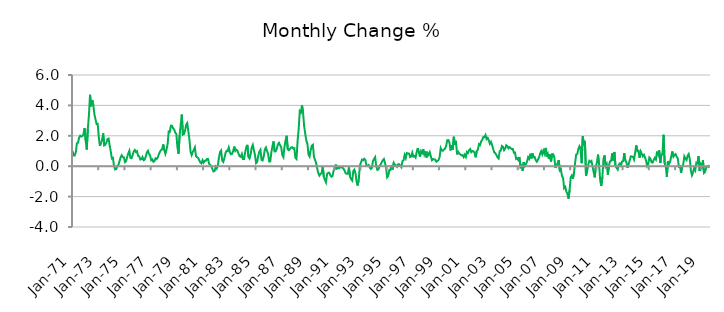
| Category | Series 0 |
|---|---|
| 1971-01-01 | 1.014 |
| 1971-02-01 | 0.711 |
| 1971-03-01 | 0.712 |
| 1971-04-01 | 0.919 |
| 1971-05-01 | 1.51 |
| 1971-06-01 | 1.551 |
| 1971-07-01 | 1.878 |
| 1971-08-01 | 2.005 |
| 1971-09-01 | 1.95 |
| 1971-10-01 | 1.987 |
| 1971-11-01 | 2.104 |
| 1971-12-01 | 2.509 |
| 1972-01-01 | 1.699 |
| 1972-02-01 | 1.094 |
| 1972-03-01 | 2.462 |
| 1972-04-01 | 3.36 |
| 1972-05-01 | 4.697 |
| 1972-06-01 | 3.937 |
| 1972-07-01 | 4.355 |
| 1972-08-01 | 4.026 |
| 1972-09-01 | 3.417 |
| 1972-10-01 | 3.088 |
| 1972-11-01 | 2.774 |
| 1972-12-01 | 2.784 |
| 1973-01-01 | 1.938 |
| 1973-02-01 | 1.343 |
| 1973-03-01 | 1.524 |
| 1973-04-01 | 1.712 |
| 1973-05-01 | 2.158 |
| 1973-06-01 | 1.373 |
| 1973-07-01 | 1.418 |
| 1973-08-01 | 1.551 |
| 1973-09-01 | 1.782 |
| 1973-10-01 | 1.816 |
| 1973-11-01 | 1.359 |
| 1973-12-01 | 0.961 |
| 1974-01-01 | 0.511 |
| 1974-02-01 | 0.548 |
| 1974-03-01 | -0.022 |
| 1974-04-01 | -0.216 |
| 1974-05-01 | -0.191 |
| 1974-06-01 | 0.007 |
| 1974-07-01 | 0.097 |
| 1974-08-01 | 0.326 |
| 1974-09-01 | 0.591 |
| 1974-10-01 | 0.722 |
| 1974-11-01 | 0.594 |
| 1974-12-01 | 0.583 |
| 1975-01-01 | 0.268 |
| 1975-02-01 | 0.337 |
| 1975-03-01 | 0.597 |
| 1975-04-01 | 0.845 |
| 1975-05-01 | 1.017 |
| 1975-06-01 | 0.539 |
| 1975-07-01 | 0.526 |
| 1975-08-01 | 0.722 |
| 1975-09-01 | 0.97 |
| 1975-10-01 | 1.067 |
| 1975-11-01 | 0.93 |
| 1975-12-01 | 0.985 |
| 1976-01-01 | 0.687 |
| 1976-02-01 | 0.643 |
| 1976-03-01 | 0.437 |
| 1976-04-01 | 0.463 |
| 1976-05-01 | 0.603 |
| 1976-06-01 | 0.392 |
| 1976-07-01 | 0.432 |
| 1976-08-01 | 0.636 |
| 1976-09-01 | 0.905 |
| 1976-10-01 | 1.011 |
| 1976-11-01 | 0.8 |
| 1976-12-01 | 0.709 |
| 1977-01-01 | 0.392 |
| 1977-02-01 | 0.448 |
| 1977-03-01 | 0.289 |
| 1977-04-01 | 0.338 |
| 1977-05-01 | 0.521 |
| 1977-06-01 | 0.47 |
| 1977-07-01 | 0.575 |
| 1977-08-01 | 0.784 |
| 1977-09-01 | 0.951 |
| 1977-10-01 | 1.061 |
| 1977-11-01 | 1.111 |
| 1977-12-01 | 1.434 |
| 1978-01-01 | 1.05 |
| 1978-02-01 | 0.811 |
| 1978-03-01 | 1.084 |
| 1978-04-01 | 1.443 |
| 1978-05-01 | 2.28 |
| 1978-06-01 | 2.255 |
| 1978-07-01 | 2.668 |
| 1978-08-01 | 2.665 |
| 1978-09-01 | 2.498 |
| 1978-10-01 | 2.424 |
| 1978-11-01 | 2.207 |
| 1978-12-01 | 2.133 |
| 1979-01-01 | 1.242 |
| 1979-02-01 | 0.823 |
| 1979-03-01 | 2.034 |
| 1979-04-01 | 2.732 |
| 1979-05-01 | 3.394 |
| 1979-06-01 | 2.083 |
| 1979-07-01 | 2.118 |
| 1979-08-01 | 2.335 |
| 1979-09-01 | 2.734 |
| 1979-10-01 | 2.841 |
| 1979-11-01 | 2.3 |
| 1979-12-01 | 1.747 |
| 1980-01-01 | 0.943 |
| 1980-02-01 | 0.726 |
| 1980-03-01 | 0.925 |
| 1980-04-01 | 1.073 |
| 1980-05-01 | 1.242 |
| 1980-06-01 | 0.656 |
| 1980-07-01 | 0.591 |
| 1980-08-01 | 0.543 |
| 1980-09-01 | 0.381 |
| 1980-10-01 | 0.243 |
| 1980-11-01 | 0.186 |
| 1980-12-01 | 0.395 |
| 1981-01-01 | 0.234 |
| 1981-02-01 | 0.354 |
| 1981-03-01 | 0.354 |
| 1981-04-01 | 0.474 |
| 1981-05-01 | 0.478 |
| 1981-06-01 | 0.161 |
| 1981-07-01 | 0.077 |
| 1981-08-01 | 0.019 |
| 1981-09-01 | -0.188 |
| 1981-10-01 | -0.344 |
| 1981-11-01 | -0.317 |
| 1981-12-01 | -0.035 |
| 1982-01-01 | -0.155 |
| 1982-02-01 | 0.068 |
| 1982-03-01 | 0.555 |
| 1982-04-01 | 0.929 |
| 1982-05-01 | 1.031 |
| 1982-06-01 | 0.372 |
| 1982-07-01 | 0.28 |
| 1982-08-01 | 0.532 |
| 1982-09-01 | 0.859 |
| 1982-10-01 | 1.012 |
| 1982-11-01 | 0.998 |
| 1982-12-01 | 1.225 |
| 1983-01-01 | 0.92 |
| 1983-02-01 | 0.783 |
| 1983-03-01 | 0.81 |
| 1983-04-01 | 0.995 |
| 1983-05-01 | 1.293 |
| 1983-06-01 | 1.001 |
| 1983-07-01 | 1.08 |
| 1983-08-01 | 1.015 |
| 1983-09-01 | 0.803 |
| 1983-10-01 | 0.652 |
| 1983-11-01 | 0.611 |
| 1983-12-01 | 0.798 |
| 1984-01-01 | 0.473 |
| 1984-02-01 | 0.478 |
| 1984-03-01 | 0.903 |
| 1984-04-01 | 1.241 |
| 1984-05-01 | 1.404 |
| 1984-06-01 | 0.614 |
| 1984-07-01 | 0.511 |
| 1984-08-01 | 0.774 |
| 1984-09-01 | 1.225 |
| 1984-10-01 | 1.401 |
| 1984-11-01 | 1.068 |
| 1984-12-01 | 0.734 |
| 1985-01-01 | 0.202 |
| 1985-02-01 | 0.279 |
| 1985-03-01 | 0.684 |
| 1985-04-01 | 0.954 |
| 1985-05-01 | 1.079 |
| 1985-06-01 | 0.413 |
| 1985-07-01 | 0.38 |
| 1985-08-01 | 0.656 |
| 1985-09-01 | 1.087 |
| 1985-10-01 | 1.228 |
| 1985-11-01 | 1.02 |
| 1985-12-01 | 0.807 |
| 1986-01-01 | 0.311 |
| 1986-02-01 | 0.317 |
| 1986-03-01 | 0.923 |
| 1986-04-01 | 1.322 |
| 1986-05-01 | 1.629 |
| 1986-06-01 | 0.97 |
| 1986-07-01 | 0.982 |
| 1986-08-01 | 1.161 |
| 1986-09-01 | 1.443 |
| 1986-10-01 | 1.536 |
| 1986-11-01 | 1.373 |
| 1986-12-01 | 1.263 |
| 1987-01-01 | 0.724 |
| 1987-02-01 | 0.595 |
| 1987-03-01 | 1.283 |
| 1987-04-01 | 1.705 |
| 1987-05-01 | 2.003 |
| 1987-06-01 | 1.108 |
| 1987-07-01 | 1.049 |
| 1987-08-01 | 1.142 |
| 1987-09-01 | 1.226 |
| 1987-10-01 | 1.253 |
| 1987-11-01 | 1.16 |
| 1987-12-01 | 1.188 |
| 1988-01-01 | 0.558 |
| 1988-02-01 | 0.478 |
| 1988-03-01 | 1.666 |
| 1988-04-01 | 2.466 |
| 1988-05-01 | 3.62 |
| 1988-06-01 | 3.526 |
| 1988-07-01 | 4.01 |
| 1988-08-01 | 3.546 |
| 1988-09-01 | 2.637 |
| 1988-10-01 | 2.133 |
| 1988-11-01 | 1.68 |
| 1988-12-01 | 1.467 |
| 1989-01-01 | 0.756 |
| 1989-02-01 | 0.634 |
| 1989-03-01 | 1.069 |
| 1989-04-01 | 1.347 |
| 1989-05-01 | 1.408 |
| 1989-06-01 | 0.607 |
| 1989-07-01 | 0.411 |
| 1989-08-01 | 0.192 |
| 1989-09-01 | -0.165 |
| 1989-10-01 | -0.462 |
| 1989-11-01 | -0.618 |
| 1989-12-01 | -0.507 |
| 1990-01-01 | -0.459 |
| 1990-02-01 | -0.019 |
| 1990-03-01 | -0.686 |
| 1990-04-01 | -0.897 |
| 1990-05-01 | -1.058 |
| 1990-06-01 | -0.51 |
| 1990-07-01 | -0.437 |
| 1990-08-01 | -0.428 |
| 1990-09-01 | -0.604 |
| 1990-10-01 | -0.695 |
| 1990-11-01 | -0.649 |
| 1990-12-01 | -0.278 |
| 1991-01-01 | -0.196 |
| 1991-02-01 | 0.105 |
| 1991-03-01 | -0.159 |
| 1991-04-01 | -0.105 |
| 1991-05-01 | -0.139 |
| 1991-06-01 | -0.062 |
| 1991-07-01 | -0.066 |
| 1991-08-01 | -0.093 |
| 1991-09-01 | -0.159 |
| 1991-10-01 | -0.285 |
| 1991-11-01 | -0.467 |
| 1991-12-01 | -0.497 |
| 1992-01-01 | -0.494 |
| 1992-02-01 | -0.076 |
| 1992-03-01 | -0.697 |
| 1992-04-01 | -0.848 |
| 1992-05-01 | -0.944 |
| 1992-06-01 | -0.312 |
| 1992-07-01 | -0.225 |
| 1992-08-01 | -0.473 |
| 1992-09-01 | -1.015 |
| 1992-10-01 | -1.272 |
| 1992-11-01 | -0.873 |
| 1992-12-01 | 0.026 |
| 1993-01-01 | 0.247 |
| 1993-02-01 | 0.437 |
| 1993-03-01 | 0.391 |
| 1993-04-01 | 0.487 |
| 1993-05-01 | 0.413 |
| 1993-06-01 | 0.047 |
| 1993-07-01 | 0.03 |
| 1993-08-01 | 0.082 |
| 1993-09-01 | -0.063 |
| 1993-10-01 | -0.18 |
| 1993-11-01 | -0.118 |
| 1993-12-01 | 0.35 |
| 1994-01-01 | 0.48 |
| 1994-02-01 | 0.595 |
| 1994-03-01 | -0.023 |
| 1994-04-01 | -0.241 |
| 1994-05-01 | -0.212 |
| 1994-06-01 | 0.019 |
| 1994-07-01 | 0.12 |
| 1994-08-01 | 0.247 |
| 1994-09-01 | 0.391 |
| 1994-10-01 | 0.472 |
| 1994-11-01 | 0.222 |
| 1994-12-01 | -0.131 |
| 1995-01-01 | -0.733 |
| 1995-02-01 | -0.635 |
| 1995-03-01 | -0.24 |
| 1995-04-01 | -0.251 |
| 1995-05-01 | 0.043 |
| 1995-06-01 | -0.212 |
| 1995-07-01 | 0.218 |
| 1995-08-01 | 0.097 |
| 1995-09-01 | 0.057 |
| 1995-10-01 | -0.036 |
| 1995-11-01 | 0.126 |
| 1995-12-01 | 0.123 |
| 1996-01-01 | 0.036 |
| 1996-02-01 | -0.061 |
| 1996-03-01 | 0.33 |
| 1996-04-01 | 0.389 |
| 1996-05-01 | 0.736 |
| 1996-06-01 | 0.535 |
| 1996-07-01 | 0.868 |
| 1996-08-01 | 0.833 |
| 1996-09-01 | 0.834 |
| 1996-10-01 | 0.603 |
| 1996-11-01 | 0.635 |
| 1996-12-01 | 0.892 |
| 1997-01-01 | 0.634 |
| 1997-02-01 | 0.672 |
| 1997-03-01 | 0.57 |
| 1997-04-01 | 0.919 |
| 1997-05-01 | 1.19 |
| 1997-06-01 | 0.893 |
| 1997-07-01 | 0.625 |
| 1997-08-01 | 0.99 |
| 1997-09-01 | 0.877 |
| 1997-10-01 | 1.126 |
| 1997-11-01 | 0.779 |
| 1997-12-01 | 0.981 |
| 1998-01-01 | 0.576 |
| 1998-02-01 | 0.861 |
| 1998-03-01 | 0.744 |
| 1998-04-01 | 0.917 |
| 1998-05-01 | 0.646 |
| 1998-06-01 | 0.394 |
| 1998-07-01 | 0.47 |
| 1998-08-01 | 0.438 |
| 1998-09-01 | 0.441 |
| 1998-10-01 | 0.291 |
| 1998-11-01 | 0.339 |
| 1998-12-01 | 0.406 |
| 1999-01-01 | 0.599 |
| 1999-02-01 | 1.189 |
| 1999-03-01 | 1.036 |
| 1999-04-01 | 1.017 |
| 1999-05-01 | 1.102 |
| 1999-06-01 | 1.154 |
| 1999-07-01 | 1.343 |
| 1999-08-01 | 1.715 |
| 1999-09-01 | 1.719 |
| 1999-10-01 | 1.552 |
| 1999-11-01 | 1.038 |
| 1999-12-01 | 1.38 |
| 2000-01-01 | 1.085 |
| 2000-02-01 | 1.936 |
| 2000-03-01 | 1.491 |
| 2000-04-01 | 1.566 |
| 2000-05-01 | 0.781 |
| 2000-06-01 | 0.949 |
| 2000-07-01 | 0.839 |
| 2000-08-01 | 0.775 |
| 2000-09-01 | 0.714 |
| 2000-10-01 | 0.729 |
| 2000-11-01 | 0.596 |
| 2000-12-01 | 0.754 |
| 2001-01-01 | 0.606 |
| 2001-02-01 | 0.935 |
| 2001-03-01 | 0.867 |
| 2001-04-01 | 1.055 |
| 2001-05-01 | 1.127 |
| 2001-06-01 | 0.924 |
| 2001-07-01 | 0.998 |
| 2001-08-01 | 0.985 |
| 2001-09-01 | 0.883 |
| 2001-10-01 | 0.588 |
| 2001-11-01 | 0.997 |
| 2001-12-01 | 1.094 |
| 2002-01-01 | 1.445 |
| 2002-02-01 | 1.384 |
| 2002-03-01 | 1.631 |
| 2002-04-01 | 1.728 |
| 2002-05-01 | 1.918 |
| 2002-06-01 | 1.906 |
| 2002-07-01 | 2.048 |
| 2002-08-01 | 1.783 |
| 2002-09-01 | 1.859 |
| 2002-10-01 | 1.71 |
| 2002-11-01 | 1.477 |
| 2002-12-01 | 1.602 |
| 2003-01-01 | 1.407 |
| 2003-02-01 | 1.139 |
| 2003-03-01 | 0.91 |
| 2003-04-01 | 0.863 |
| 2003-05-01 | 0.726 |
| 2003-06-01 | 0.579 |
| 2003-07-01 | 0.508 |
| 2003-08-01 | 0.993 |
| 2003-09-01 | 1.027 |
| 2003-10-01 | 1.329 |
| 2003-11-01 | 1.273 |
| 2003-12-01 | 1.053 |
| 2004-01-01 | 1.155 |
| 2004-02-01 | 1.378 |
| 2004-03-01 | 1.315 |
| 2004-04-01 | 1.176 |
| 2004-05-01 | 1.263 |
| 2004-06-01 | 1.184 |
| 2004-07-01 | 1.129 |
| 2004-08-01 | 1.135 |
| 2004-09-01 | 0.885 |
| 2004-10-01 | 0.896 |
| 2004-11-01 | 0.481 |
| 2004-12-01 | 0.525 |
| 2005-01-01 | 0.412 |
| 2005-02-01 | 0.601 |
| 2005-03-01 | -0.056 |
| 2005-04-01 | 0.041 |
| 2005-05-01 | -0.312 |
| 2005-06-01 | 0.273 |
| 2005-07-01 | 0.005 |
| 2005-08-01 | 0.13 |
| 2005-09-01 | 0.301 |
| 2005-10-01 | 0.587 |
| 2005-11-01 | 0.481 |
| 2005-12-01 | 0.815 |
| 2006-01-01 | 0.512 |
| 2006-02-01 | 0.839 |
| 2006-03-01 | 0.59 |
| 2006-04-01 | 0.61 |
| 2006-05-01 | 0.39 |
| 2006-06-01 | 0.294 |
| 2006-07-01 | 0.43 |
| 2006-08-01 | 0.57 |
| 2006-09-01 | 0.838 |
| 2006-10-01 | 0.993 |
| 2006-11-01 | 0.782 |
| 2006-12-01 | 1.025 |
| 2007-01-01 | 0.837 |
| 2007-02-01 | 1.203 |
| 2007-03-01 | 0.635 |
| 2007-04-01 | 0.824 |
| 2007-05-01 | 0.476 |
| 2007-06-01 | 0.769 |
| 2007-07-01 | 0.305 |
| 2007-08-01 | 0.796 |
| 2007-09-01 | 0.787 |
| 2007-10-01 | 0.58 |
| 2007-11-01 | -0.112 |
| 2007-12-01 | 0.065 |
| 2008-01-01 | 0.173 |
| 2008-02-01 | 0.401 |
| 2008-03-01 | -0.272 |
| 2008-04-01 | -0.195 |
| 2008-05-01 | -0.647 |
| 2008-06-01 | -0.781 |
| 2008-07-01 | -1.442 |
| 2008-08-01 | -1.364 |
| 2008-09-01 | -1.669 |
| 2008-10-01 | -1.821 |
| 2008-11-01 | -2.138 |
| 2008-12-01 | -1.553 |
| 2009-01-01 | -0.731 |
| 2009-02-01 | -0.621 |
| 2009-03-01 | -0.825 |
| 2009-04-01 | -0.427 |
| 2009-05-01 | 0.213 |
| 2009-06-01 | 0.764 |
| 2009-07-01 | 0.798 |
| 2009-08-01 | 1.133 |
| 2009-09-01 | 1.32 |
| 2009-10-01 | 1.163 |
| 2009-11-01 | 0.201 |
| 2009-12-01 | 1.966 |
| 2010-01-01 | 1.507 |
| 2010-02-01 | 1.665 |
| 2010-03-01 | -0.631 |
| 2010-04-01 | -0.333 |
| 2010-05-01 | 0.073 |
| 2010-06-01 | 0.35 |
| 2010-07-01 | 0.284 |
| 2010-08-01 | 0.345 |
| 2010-09-01 | -0.014 |
| 2010-10-01 | -0.392 |
| 2010-11-01 | -0.732 |
| 2010-12-01 | -0.005 |
| 2011-01-01 | 0.24 |
| 2011-02-01 | 0.761 |
| 2011-03-01 | 0.093 |
| 2011-04-01 | -0.951 |
| 2011-05-01 | -1.297 |
| 2011-06-01 | -0.711 |
| 2011-07-01 | 0.487 |
| 2011-08-01 | 0.71 |
| 2011-09-01 | -0.012 |
| 2011-10-01 | 0.126 |
| 2011-11-01 | -0.566 |
| 2011-12-01 | 0.032 |
| 2012-01-01 | 0.323 |
| 2012-02-01 | 0.352 |
| 2012-03-01 | 0.849 |
| 2012-04-01 | 0.375 |
| 2012-05-01 | 0.938 |
| 2012-06-01 | 0.004 |
| 2012-07-01 | -0.1 |
| 2012-08-01 | -0.217 |
| 2012-09-01 | 0.1 |
| 2012-10-01 | 0.185 |
| 2012-11-01 | 0.047 |
| 2012-12-01 | 0.311 |
| 2013-01-01 | 0.331 |
| 2013-02-01 | 0.856 |
| 2013-03-01 | 0.368 |
| 2013-04-01 | 0.266 |
| 2013-05-01 | -0.109 |
| 2013-06-01 | 0.137 |
| 2013-07-01 | 0.377 |
| 2013-08-01 | 0.653 |
| 2013-09-01 | 0.637 |
| 2013-10-01 | 0.618 |
| 2013-11-01 | 0.442 |
| 2013-12-01 | 0.903 |
| 2014-01-01 | 1.372 |
| 2014-02-01 | 0.988 |
| 2014-03-01 | 1.017 |
| 2014-04-01 | 0.553 |
| 2014-05-01 | 0.975 |
| 2014-06-01 | 0.817 |
| 2014-07-01 | 0.649 |
| 2014-08-01 | 0.748 |
| 2014-09-01 | 0.573 |
| 2014-10-01 | 0.364 |
| 2014-11-01 | 0.006 |
| 2014-12-01 | 0.136 |
| 2015-01-01 | 0.576 |
| 2015-02-01 | 0.494 |
| 2015-03-01 | 0.259 |
| 2015-04-01 | 0.24 |
| 2015-05-01 | 0.421 |
| 2015-06-01 | 0.552 |
| 2015-07-01 | 0.44 |
| 2015-08-01 | 0.958 |
| 2015-09-01 | 0.755 |
| 2015-10-01 | 1.043 |
| 2015-11-01 | 0.212 |
| 2015-12-01 | 0.764 |
| 2016-01-01 | 0.798 |
| 2016-02-01 | 2.067 |
| 2016-03-01 | 0.169 |
| 2016-04-01 | -0.006 |
| 2016-05-01 | -0.698 |
| 2016-06-01 | 0.334 |
| 2016-07-01 | 0.14 |
| 2016-08-01 | 0.289 |
| 2016-09-01 | 0.636 |
| 2016-10-01 | 0.968 |
| 2016-11-01 | 0.632 |
| 2016-12-01 | 0.743 |
| 2017-01-01 | 0.799 |
| 2017-02-01 | 0.608 |
| 2017-03-01 | 0.525 |
| 2017-04-01 | -0.033 |
| 2017-05-01 | -0.003 |
| 2017-06-01 | -0.431 |
| 2017-07-01 | -0.06 |
| 2017-08-01 | 0.117 |
| 2017-09-01 | 0.643 |
| 2017-10-01 | 0.49 |
| 2017-11-01 | 0.401 |
| 2017-12-01 | 0.693 |
| 2018-01-01 | 0.801 |
| 2018-02-01 | 0.475 |
| 2018-03-01 | -0.282 |
| 2018-04-01 | -0.593 |
| 2018-05-01 | -0.413 |
| 2018-06-01 | -0.108 |
| 2018-07-01 | -0.265 |
| 2018-08-01 | 0.231 |
| 2018-09-01 | 0.187 |
| 2018-10-01 | 0.665 |
| 2018-11-01 | -0.318 |
| 2018-12-01 | 0.119 |
| 2019-01-01 | -0.033 |
| 2019-02-01 | 0.395 |
| 2019-03-01 | -0.443 |
| 2019-04-01 | -0.372 |
| 2019-05-01 | -0.107 |
| 2019-06-01 | -0.002 |
| 2019-07-01 | 0.021 |
| 2019-08-01 | -0.096 |